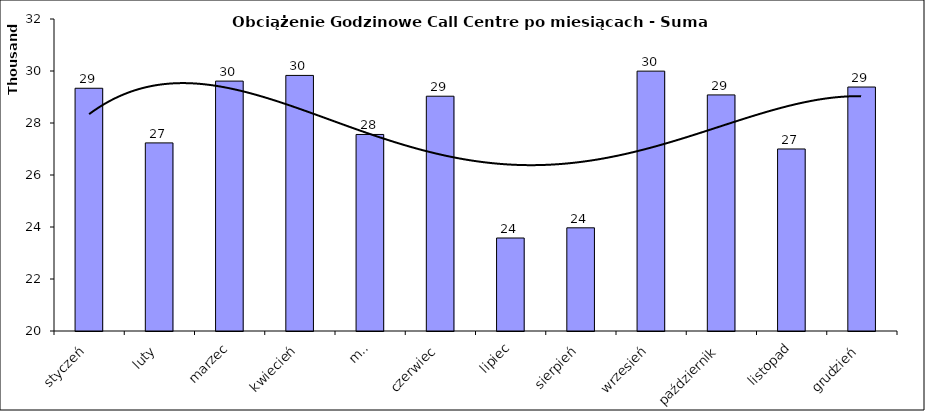
| Category | Series 0 |
|---|---|
| styczeń | 29336.1 |
| luty | 27234.4 |
| marzec | 29612 |
| kwiecień | 29830.2 |
| maj | 27559.2 |
| czerwiec | 29030.3 |
| lipiec | 23576.6 |
| sierpień | 23968.2 |
| wrzesień | 29994.7 |
| październik | 29080.2 |
| listopad | 27000.7 |
| grudzień | 29383.8 |